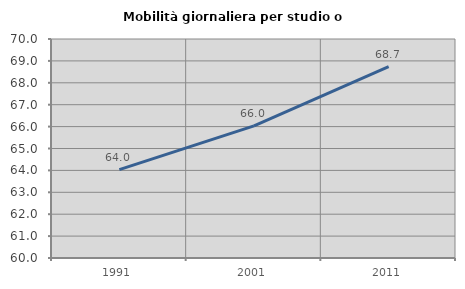
| Category | Mobilità giornaliera per studio o lavoro |
|---|---|
| 1991.0 | 64.033 |
| 2001.0 | 66.033 |
| 2011.0 | 68.738 |